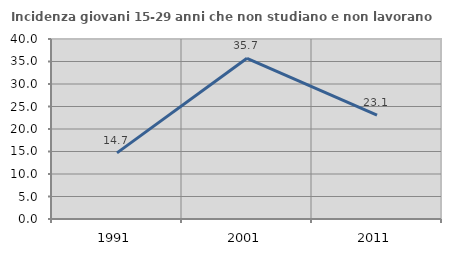
| Category | Incidenza giovani 15-29 anni che non studiano e non lavorano  |
|---|---|
| 1991.0 | 14.689 |
| 2001.0 | 35.714 |
| 2011.0 | 23.077 |